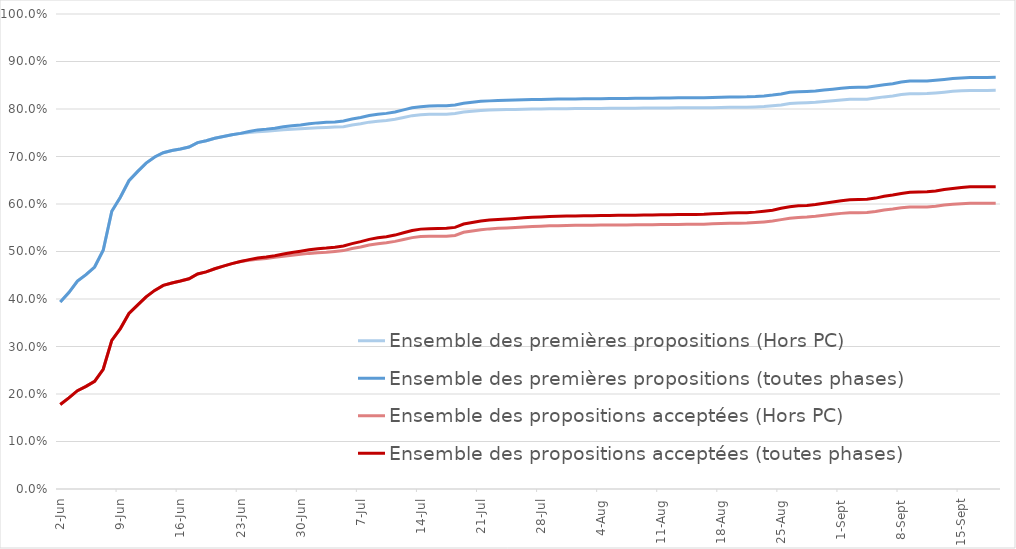
| Category | Ensemble des premières propositions (Hors PC) | Ensemble des premières propositions (toutes phases) | Ensemble des propositions acceptées (Hors PC) | Ensemble des propositions acceptées (toutes phases) |
|---|---|---|---|---|
| 2022-06-02 | 0.394 | 0.394 | 0.178 | 0.178 |
| 2022-06-03 | 0.414 | 0.414 | 0.192 | 0.192 |
| 2022-06-04 | 0.438 | 0.438 | 0.207 | 0.207 |
| 2022-06-05 | 0.451 | 0.451 | 0.216 | 0.216 |
| 2022-06-06 | 0.467 | 0.467 | 0.227 | 0.227 |
| 2022-06-07 | 0.503 | 0.503 | 0.252 | 0.252 |
| 2022-06-08 | 0.585 | 0.585 | 0.313 | 0.313 |
| 2022-06-09 | 0.614 | 0.614 | 0.338 | 0.338 |
| 2022-06-10 | 0.649 | 0.649 | 0.369 | 0.369 |
| 2022-06-11 | 0.668 | 0.668 | 0.387 | 0.387 |
| 2022-06-12 | 0.686 | 0.686 | 0.404 | 0.404 |
| 2022-06-13 | 0.699 | 0.699 | 0.418 | 0.418 |
| 2022-06-14 | 0.708 | 0.708 | 0.429 | 0.429 |
| 2022-06-15 | 0.713 | 0.713 | 0.434 | 0.434 |
| 2022-06-16 | 0.716 | 0.716 | 0.438 | 0.438 |
| 2022-06-17 | 0.72 | 0.72 | 0.443 | 0.443 |
| 2022-06-18 | 0.729 | 0.729 | 0.453 | 0.453 |
| 2022-06-19 | 0.733 | 0.733 | 0.457 | 0.457 |
| 2022-06-20 | 0.738 | 0.738 | 0.464 | 0.464 |
| 2022-06-21 | 0.742 | 0.742 | 0.469 | 0.469 |
| 2022-06-22 | 0.746 | 0.746 | 0.475 | 0.475 |
| 2022-06-23 | 0.749 | 0.749 | 0.479 | 0.479 |
| 2022-06-24 | 0.751 | 0.753 | 0.481 | 0.483 |
| 2022-06-25 | 0.752 | 0.756 | 0.484 | 0.486 |
| 2022-06-26 | 0.753 | 0.758 | 0.485 | 0.488 |
| 2022-06-27 | 0.755 | 0.76 | 0.488 | 0.491 |
| 2022-06-28 | 0.756 | 0.763 | 0.49 | 0.495 |
| 2022-06-29 | 0.757 | 0.765 | 0.492 | 0.498 |
| 2022-06-30 | 0.758 | 0.767 | 0.494 | 0.501 |
| 2022-07-01 | 0.759 | 0.769 | 0.496 | 0.504 |
| 2022-07-02 | 0.76 | 0.771 | 0.497 | 0.506 |
| 2022-07-03 | 0.761 | 0.772 | 0.498 | 0.507 |
| 2022-07-04 | 0.762 | 0.773 | 0.5 | 0.509 |
| 2022-07-05 | 0.763 | 0.775 | 0.502 | 0.512 |
| 2022-07-06 | 0.766 | 0.779 | 0.506 | 0.517 |
| 2022-07-07 | 0.769 | 0.782 | 0.51 | 0.521 |
| 2022-07-08 | 0.772 | 0.786 | 0.514 | 0.526 |
| 2022-07-09 | 0.774 | 0.789 | 0.516 | 0.529 |
| 2022-07-10 | 0.776 | 0.791 | 0.518 | 0.531 |
| 2022-07-11 | 0.779 | 0.794 | 0.521 | 0.535 |
| 2022-07-12 | 0.782 | 0.798 | 0.525 | 0.539 |
| 2022-07-13 | 0.786 | 0.803 | 0.529 | 0.544 |
| 2022-07-14 | 0.788 | 0.805 | 0.531 | 0.547 |
| 2022-07-15 | 0.789 | 0.806 | 0.532 | 0.548 |
| 2022-07-16 | 0.789 | 0.807 | 0.532 | 0.549 |
| 2022-07-17 | 0.789 | 0.807 | 0.532 | 0.549 |
| 2022-07-18 | 0.79 | 0.809 | 0.534 | 0.551 |
| 2022-07-19 | 0.793 | 0.812 | 0.54 | 0.558 |
| 2022-07-20 | 0.795 | 0.814 | 0.543 | 0.561 |
| 2022-07-21 | 0.797 | 0.816 | 0.546 | 0.564 |
| 2022-07-22 | 0.798 | 0.817 | 0.548 | 0.566 |
| 2022-07-23 | 0.798 | 0.818 | 0.549 | 0.568 |
| 2022-07-24 | 0.799 | 0.818 | 0.55 | 0.568 |
| 2022-07-25 | 0.799 | 0.819 | 0.551 | 0.57 |
| 2022-07-26 | 0.8 | 0.819 | 0.552 | 0.571 |
| 2022-07-27 | 0.8 | 0.82 | 0.553 | 0.572 |
| 2022-07-28 | 0.8 | 0.82 | 0.553 | 0.573 |
| 2022-07-29 | 0.8 | 0.821 | 0.554 | 0.574 |
| 2022-07-30 | 0.801 | 0.821 | 0.554 | 0.574 |
| 2022-07-31 | 0.801 | 0.821 | 0.555 | 0.574 |
| 2022-08-01 | 0.801 | 0.821 | 0.555 | 0.575 |
| 2022-08-02 | 0.801 | 0.821 | 0.555 | 0.575 |
| 2022-08-03 | 0.801 | 0.822 | 0.555 | 0.575 |
| 2022-08-04 | 0.801 | 0.822 | 0.556 | 0.576 |
| 2022-08-05 | 0.801 | 0.822 | 0.556 | 0.576 |
| 2022-08-06 | 0.801 | 0.822 | 0.556 | 0.576 |
| 2022-08-07 | 0.802 | 0.822 | 0.556 | 0.576 |
| 2022-08-08 | 0.802 | 0.822 | 0.556 | 0.576 |
| 2022-08-09 | 0.802 | 0.823 | 0.556 | 0.577 |
| 2022-08-10 | 0.802 | 0.823 | 0.557 | 0.577 |
| 2022-08-11 | 0.802 | 0.823 | 0.557 | 0.577 |
| 2022-08-12 | 0.802 | 0.823 | 0.557 | 0.578 |
| 2022-08-13 | 0.802 | 0.823 | 0.557 | 0.578 |
| 2022-08-14 | 0.802 | 0.824 | 0.557 | 0.578 |
| 2022-08-15 | 0.802 | 0.824 | 0.557 | 0.578 |
| 2022-08-16 | 0.803 | 0.824 | 0.558 | 0.578 |
| 2022-08-17 | 0.803 | 0.824 | 0.558 | 0.579 |
| 2022-08-18 | 0.803 | 0.825 | 0.559 | 0.58 |
| 2022-08-19 | 0.804 | 0.825 | 0.559 | 0.581 |
| 2022-08-20 | 0.804 | 0.826 | 0.56 | 0.581 |
| 2022-08-21 | 0.804 | 0.826 | 0.56 | 0.582 |
| 2022-08-22 | 0.804 | 0.826 | 0.561 | 0.583 |
| 2022-08-23 | 0.805 | 0.828 | 0.562 | 0.585 |
| 2022-08-24 | 0.807 | 0.829 | 0.564 | 0.587 |
| 2022-08-25 | 0.808 | 0.832 | 0.567 | 0.591 |
| 2022-08-26 | 0.812 | 0.835 | 0.57 | 0.594 |
| 2022-08-27 | 0.813 | 0.836 | 0.572 | 0.596 |
| 2022-08-28 | 0.813 | 0.837 | 0.572 | 0.597 |
| 2022-08-29 | 0.814 | 0.838 | 0.574 | 0.599 |
| 2022-08-30 | 0.816 | 0.84 | 0.576 | 0.602 |
| 2022-08-31 | 0.817 | 0.842 | 0.578 | 0.604 |
| 2022-09-01 | 0.819 | 0.843 | 0.58 | 0.607 |
| 2022-09-02 | 0.821 | 0.846 | 0.582 | 0.609 |
| 2022-09-03 | 0.821 | 0.846 | 0.582 | 0.609 |
| 2022-09-04 | 0.821 | 0.846 | 0.582 | 0.61 |
| 2022-09-05 | 0.823 | 0.849 | 0.584 | 0.612 |
| 2022-09-06 | 0.826 | 0.851 | 0.587 | 0.616 |
| 2022-09-07 | 0.827 | 0.853 | 0.589 | 0.619 |
| 2022-09-08 | 0.831 | 0.857 | 0.592 | 0.622 |
| 2022-09-09 | 0.832 | 0.859 | 0.594 | 0.625 |
| 2022-09-10 | 0.832 | 0.859 | 0.594 | 0.625 |
| 2022-09-11 | 0.832 | 0.859 | 0.594 | 0.626 |
| 2022-09-12 | 0.834 | 0.86 | 0.595 | 0.627 |
| 2022-09-13 | 0.835 | 0.862 | 0.598 | 0.63 |
| 2022-09-14 | 0.837 | 0.864 | 0.599 | 0.633 |
| 2022-09-15 | 0.838 | 0.865 | 0.6 | 0.635 |
| 2022-09-16 | 0.839 | 0.866 | 0.601 | 0.636 |
| 2022-09-17 | 0.839 | 0.866 | 0.601 | 0.636 |
| 2022-09-18 | 0.839 | 0.866 | 0.601 | 0.636 |
| 2022-09-19 | 0.839 | 0.867 | 0.602 | 0.637 |